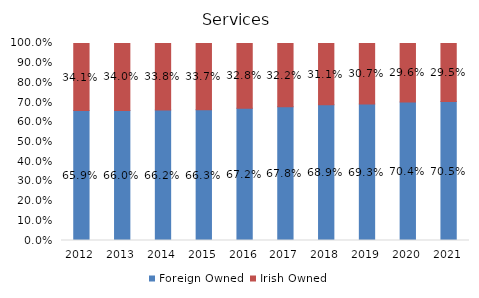
| Category | Foreign Owned | Irish Owned |
|---|---|---|
| 2012.0 | 0.659 | 0.341 |
| 2013.0 | 0.66 | 0.34 |
| 2014.0 | 0.662 | 0.338 |
| 2015.0 | 0.663 | 0.337 |
| 2016.0 | 0.672 | 0.328 |
| 2017.0 | 0.678 | 0.322 |
| 2018.0 | 0.689 | 0.311 |
| 2019.0 | 0.693 | 0.307 |
| 2020.0 | 0.704 | 0.296 |
| 2021.0 | 0.705 | 0.295 |